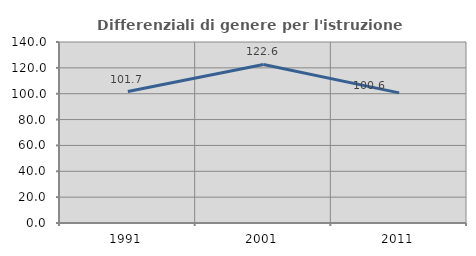
| Category | Differenziali di genere per l'istruzione superiore |
|---|---|
| 1991.0 | 101.678 |
| 2001.0 | 122.639 |
| 2011.0 | 100.625 |